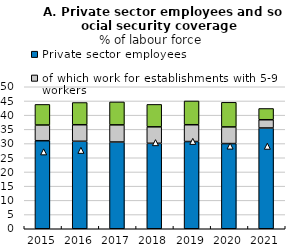
| Category | Private sector employees | of which work for establishments with 5-9 workers | of which work for establishments with 1-4 workers |
|---|---|---|---|
| 2015.0 | 30.997 | 5.531 | 7.254 |
| 2016.0 | 30.806 | 5.823 | 7.822 |
| 2017.0 | 30.542 | 6.036 | 8.083 |
| 2018.0 | 30.086 | 5.799 | 7.902 |
| 2019.0 | 30.715 | 5.915 | 8.372 |
| 2020.0 | 29.991 | 5.868 | 8.667 |
| 2021.0 | 35.476 | 2.904 | 3.97 |